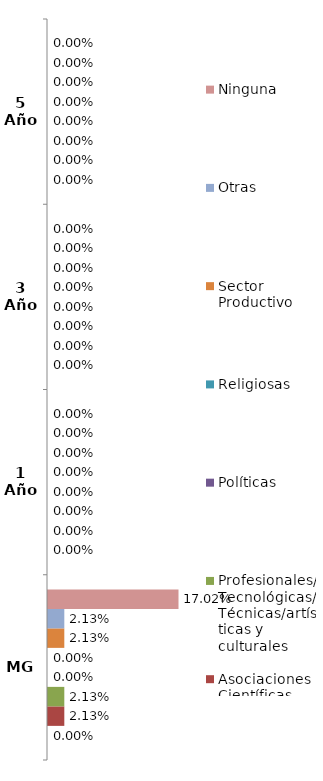
| Category | Comunidades Académicas reconocidas | Asociaciones Científicas | Profesionales/ Tecnológicas/Técnicas/artísticas y culturales | Políticas | Religiosas | Sector Productivo | Otras | Ninguna |
|---|---|---|---|---|---|---|---|---|
| MG | 0 | 0.021 | 0.021 | 0 | 0 | 0.021 | 0.021 | 0.17 |
| 1 Año | 0 | 0 | 0 | 0 | 0 | 0 | 0 | 0 |
| 3 Año | 0 | 0 | 0 | 0 | 0 | 0 | 0 | 0 |
| 5 Año | 0 | 0 | 0 | 0 | 0 | 0 | 0 | 0 |